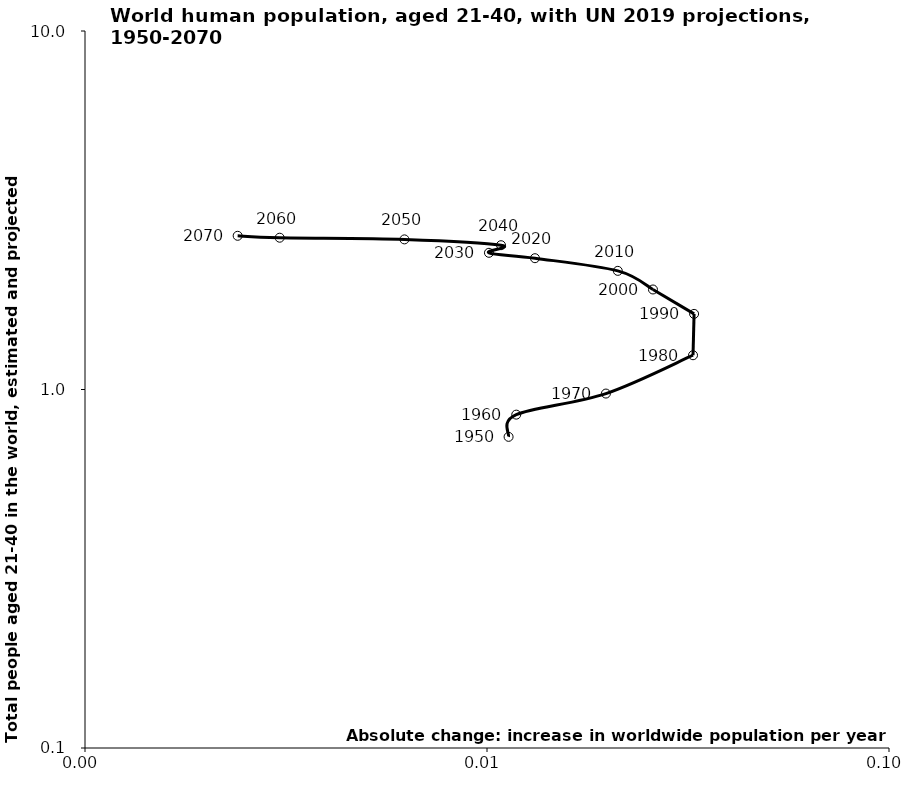
| Category | Series 0 |
|---|---|
| 0.011315642000000015 | 0.738 |
| 0.011823938849999998 | 0.851 |
| 0.01976164605000001 | 0.974 |
| 0.03254634825000002 | 1.246 |
| 0.03274320999999998 | 1.625 |
| 0.02587191759999997 | 1.901 |
| 0.021153610400000012 | 2.143 |
| 0.01316164875000001 | 2.324 |
| 0.010112099250000006 | 2.406 |
| 0.010836312000000037 | 2.526 |
| 0.0062318990000000294 | 2.623 |
| 0.0030500735999999585 | 2.651 |
| 0.0023974813999999346 | 2.684 |